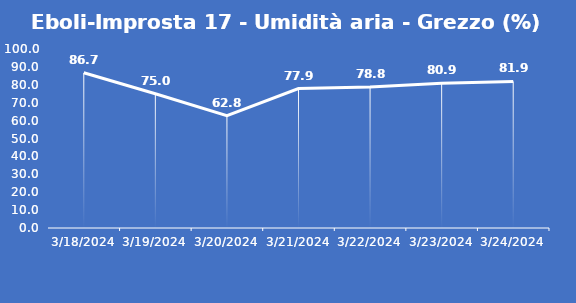
| Category | Eboli-Improsta 17 - Umidità aria - Grezzo (%) |
|---|---|
| 3/18/24 | 86.7 |
| 3/19/24 | 75 |
| 3/20/24 | 62.8 |
| 3/21/24 | 77.9 |
| 3/22/24 | 78.8 |
| 3/23/24 | 80.9 |
| 3/24/24 | 81.9 |